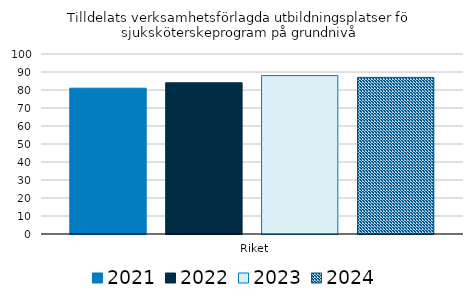
| Category | 2021 | 2022 | 2023 | 2024 |
|---|---|---|---|---|
|   Riket | 81 | 84 | 88 | 87 |